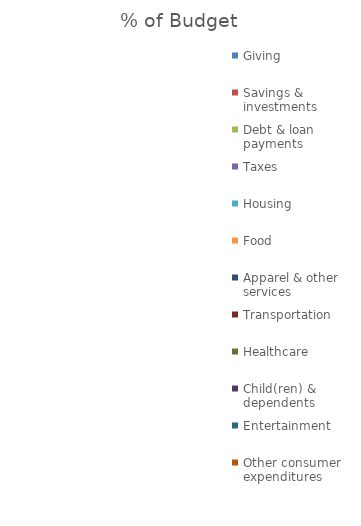
| Category | % of Budget |
|---|---|
| Giving | 0 |
| Savings & investments | 0 |
| Debt & loan payments | 0 |
| Taxes | 0 |
| Housing | 0 |
| Food | 0 |
| Apparel & other services | 0 |
| Transportation | 0 |
| Healthcare | 0 |
| Child(ren) & dependents | 0 |
| Entertainment | 0 |
| Other consumer expenditures | 0 |